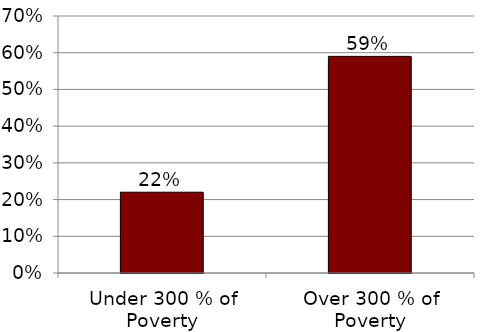
| Category | Series 0 |
|---|---|
| Under 300 % of Poverty | 0.22 |
| Over 300 % of Poverty | 0.59 |